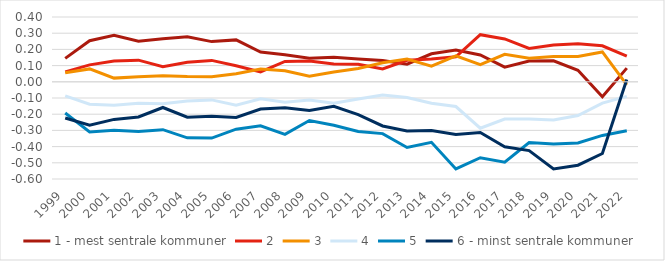
| Category | 1 - mest sentrale kommuner | 2 | 3 | 4 | 5 | 6 - minst sentrale kommuner  |
|---|---|---|---|---|---|---|
| 1999.0 | 0.145 | 0.061 | 0.056 | -0.087 | -0.193 | -0.223 |
| 2000.0 | 0.253 | 0.104 | 0.08 | -0.139 | -0.31 | -0.268 |
| 2001.0 | 0.287 | 0.129 | 0.023 | -0.144 | -0.3 | -0.232 |
| 2002.0 | 0.25 | 0.134 | 0.032 | -0.132 | -0.306 | -0.217 |
| 2003.0 | 0.265 | 0.094 | 0.038 | -0.136 | -0.295 | -0.159 |
| 2004.0 | 0.278 | 0.12 | 0.033 | -0.118 | -0.346 | -0.219 |
| 2005.0 | 0.248 | 0.132 | 0.032 | -0.112 | -0.348 | -0.213 |
| 2006.0 | 0.259 | 0.1 | 0.05 | -0.145 | -0.292 | -0.22 |
| 2007.0 | 0.184 | 0.061 | 0.08 | -0.105 | -0.272 | -0.168 |
| 2008.0 | 0.166 | 0.126 | 0.068 | -0.127 | -0.324 | -0.16 |
| 2009.0 | 0.146 | 0.128 | 0.034 | -0.113 | -0.239 | -0.178 |
| 2010.0 | 0.152 | 0.11 | 0.061 | -0.132 | -0.268 | -0.152 |
| 2011.0 | 0.14 | 0.108 | 0.082 | -0.107 | -0.307 | -0.203 |
| 2012.0 | 0.132 | 0.08 | 0.118 | -0.081 | -0.32 | -0.273 |
| 2013.0 | 0.109 | 0.133 | 0.141 | -0.097 | -0.406 | -0.303 |
| 2014.0 | 0.173 | 0.14 | 0.097 | -0.132 | -0.374 | -0.3 |
| 2015.0 | 0.197 | 0.154 | 0.16 | -0.153 | -0.538 | -0.325 |
| 2016.0 | 0.166 | 0.291 | 0.106 | -0.286 | -0.468 | -0.313 |
| 2017.0 | 0.091 | 0.265 | 0.17 | -0.23 | -0.496 | -0.401 |
| 2018.0 | 0.128 | 0.206 | 0.146 | -0.229 | -0.375 | -0.425 |
| 2019.0 | 0.13 | 0.227 | 0.156 | -0.235 | -0.385 | -0.538 |
| 2020.0 | 0.071 | 0.234 | 0.157 | -0.208 | -0.378 | -0.515 |
| 2021.0 | -0.092 | 0.222 | 0.184 | -0.131 | -0.331 | -0.443 |
| 2022.0 | 0.084 | 0.158 | -0.019 | -0.09 | -0.303 | 0.015 |